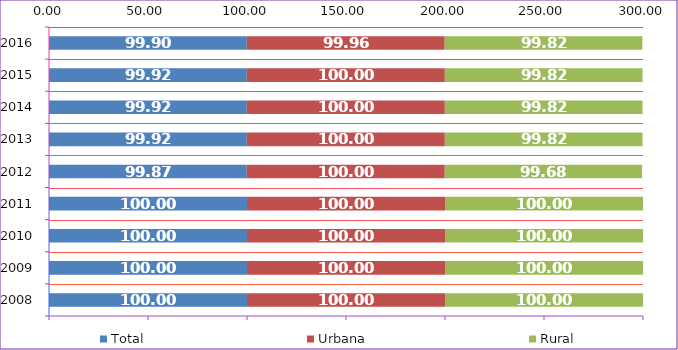
| Category | Total | Urbana | Rural |
|---|---|---|---|
| 2008.0 | 100 | 100 | 100 |
| 2009.0 | 100 | 100 | 100 |
| 2010.0 | 100 | 100 | 100 |
| 2011.0 | 100 | 100 | 100 |
| 2012.0 | 99.87 | 100 | 99.68 |
| 2013.0 | 99.92 | 100 | 99.82 |
| 2014.0 | 99.92 | 100 | 99.82 |
| 2015.0 | 99.92 | 100 | 99.82 |
| 2016.0 | 99.9 | 99.96 | 99.82 |